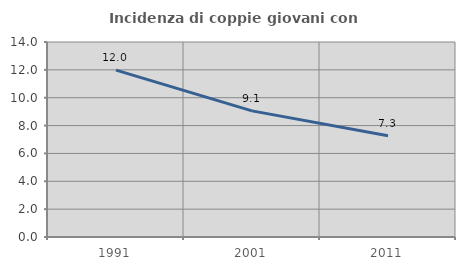
| Category | Incidenza di coppie giovani con figli |
|---|---|
| 1991.0 | 11.979 |
| 2001.0 | 9.053 |
| 2011.0 | 7.269 |